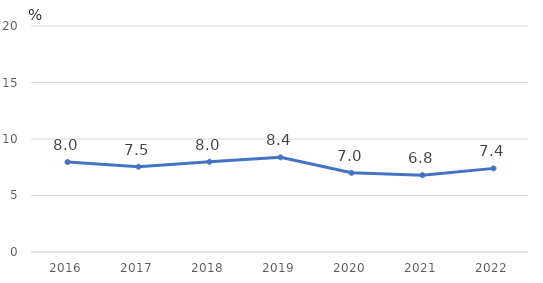
| Category | Series 0 |
|---|---|
| 2016.0 | 7.964 |
| 2017.0 | 7.546 |
| 2018.0 | 7.984 |
| 2019.0 | 8.376 |
| 2020.0 | 7.008 |
| 2021.0 | 6.8 |
| 2022.0 | 7.4 |